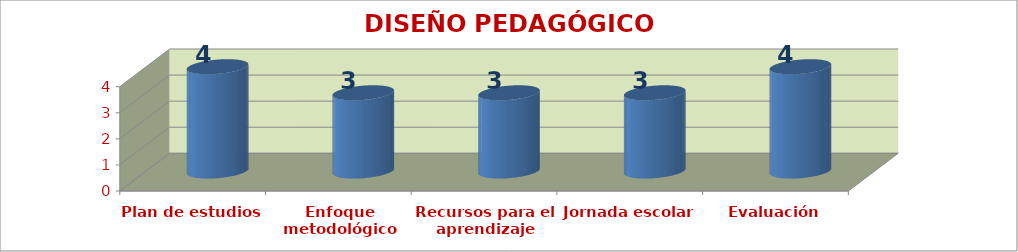
| Category | DISEÑO PEDAGÓGICO (CURRICULAR) |
|---|---|
| Plan de estudios | 4 |
| Enfoque metodológico | 3 |
| Recursos para el aprendizaje | 3 |
| Jornada escolar | 3 |
| Evaluación | 4 |